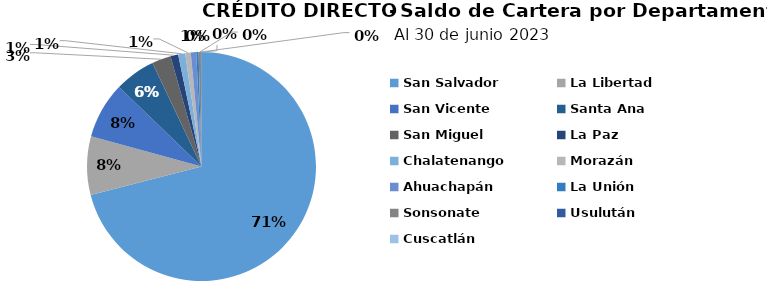
| Category | Saldo |
|---|---|
| San Salvador | 139.008 |
| La Libertad | 16.207 |
| San Vicente | 15.557 |
| Santa Ana | 11.285 |
| San Miguel | 5.231 |
| La Paz | 2.144 |
| Chalatenango | 1.95 |
| Morazán | 1.52 |
| Ahuachapán | 1.513 |
| La Unión | 0.638 |
| Sonsonate | 0.608 |
| Usulután | 0.157 |
| Cuscatlán | 0.022 |